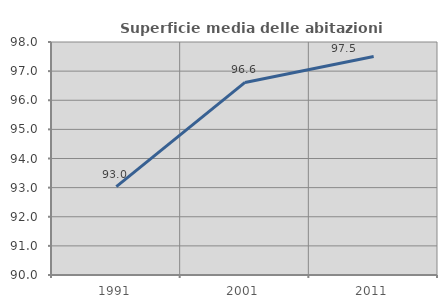
| Category | Superficie media delle abitazioni occupate |
|---|---|
| 1991.0 | 93.037 |
| 2001.0 | 96.612 |
| 2011.0 | 97.504 |